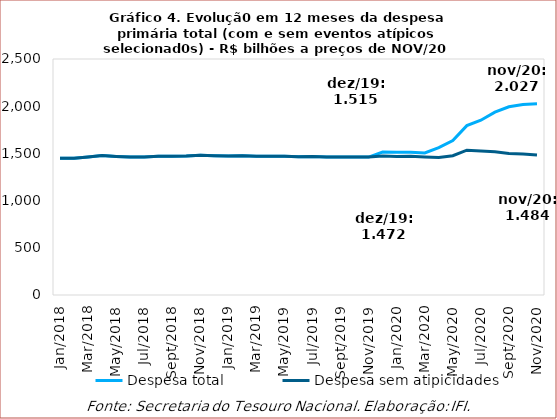
| Category | Despesa total | Despesa sem atipicidades |
|---|---|---|
| 2018-01-01 | 1448469.831 | 1448469.831 |
| 2018-02-01 | 1447839.27 | 1447839.27 |
| 2018-03-01 | 1461959.466 | 1461959.466 |
| 2018-04-01 | 1477104.922 | 1477104.922 |
| 2018-05-01 | 1468440.696 | 1468440.696 |
| 2018-06-01 | 1462064.191 | 1462064.191 |
| 2018-07-01 | 1461835.182 | 1461835.182 |
| 2018-08-01 | 1468651.737 | 1468651.737 |
| 2018-09-01 | 1470812.899 | 1470812.899 |
| 2018-10-01 | 1473706.063 | 1473706.063 |
| 2018-11-01 | 1480134.709 | 1480134.709 |
| 2018-12-01 | 1474798.425 | 1474798.425 |
| 2019-01-01 | 1472092.892 | 1472092.892 |
| 2019-02-01 | 1474582.447 | 1474582.447 |
| 2019-03-01 | 1470510.927 | 1470510.927 |
| 2019-04-01 | 1471127.247 | 1471127.247 |
| 2019-05-01 | 1469496.059 | 1469496.059 |
| 2019-06-01 | 1464690.494 | 1464690.494 |
| 2019-07-01 | 1467359.345 | 1467359.345 |
| 2019-08-01 | 1462064.534 | 1462064.534 |
| 2019-09-01 | 1462435.091 | 1462435.091 |
| 2019-10-01 | 1462410.645 | 1462410.645 |
| 2019-11-01 | 1461419.486 | 1461419.486 |
| 2019-12-01 | 1515162.572 | 1472056.226 |
| 2020-01-01 | 1511329.786 | 1468223.44 |
| 2020-02-01 | 1511845.01 | 1468738.53 |
| 2020-03-01 | 1505249.274 | 1461077.719 |
| 2020-04-01 | 1560885.484 | 1455585.941 |
| 2020-05-01 | 1636428.992 | 1476014.844 |
| 2020-06-01 | 1794412.537 | 1534249.304 |
| 2020-07-01 | 1851070.071 | 1526480.018 |
| 2020-08-01 | 1937575.153 | 1517639.108 |
| 2020-09-01 | 1993996.762 | 1499270.452 |
| 2020-10-01 | 2018666.166 | 1494751.362 |
| 2020-11-01 | 2026516.872 | 1484114.974 |